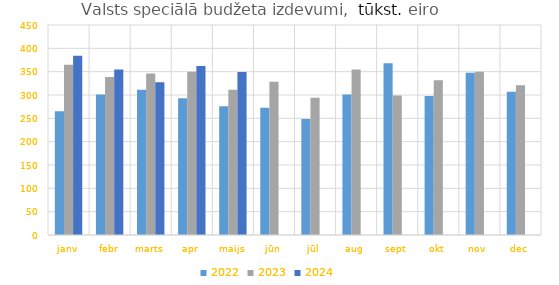
| Category | 2022 | 2023 | 2024 |
|---|---|---|---|
| janv | 265366.62 | 364905.213 | 384082.641 |
| febr | 301122.134 | 338753.3 | 354883.67 |
| marts | 311449.105 | 346087.76 | 327126.696 |
| apr | 292908.695 | 349816.348 | 361926.333 |
| maijs | 276006.043 | 311041.84 | 349325.477 |
| jūn | 272418.808 | 328139.664 | 0 |
| jūl | 248833.143 | 293936.464 | 0 |
| aug | 300867.01 | 354471.084 | 0 |
| sept | 368202.062 | 298878.279 | 0 |
| okt | 298051.418 | 331478.763 | 0 |
| nov | 347493.693 | 349793.266 | 0 |
| dec | 306911.749 | 320964.427 | 0 |